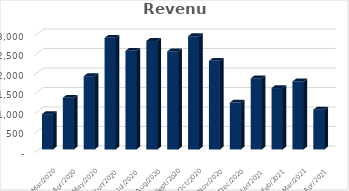
| Category | Revenue |
|---|---|
| 2021-04-30 | 1021.1 |
| 2021-03-31 | 1744.5 |
| 2021-02-28 | 1575 |
| 2021-01-31 | 1823.3 |
| 2020-12-31 | 1203.2 |
| 2020-11-30 | 2273.4 |
| 2020-10-31 | 2907.1 |
| 2020-09-30 | 2518.7 |
| 2020-08-31 | 2785.3 |
| 2020-07-31 | 2533.1 |
| 2020-06-30 | 2865.8 |
| 2020-05-31 | 1879.6 |
| 2020-04-30 | 1326.6 |
| 2020-03-31 | 906.3 |